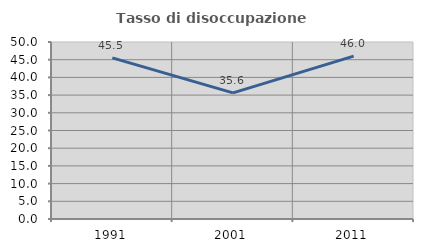
| Category | Tasso di disoccupazione giovanile  |
|---|---|
| 1991.0 | 45.522 |
| 2001.0 | 35.632 |
| 2011.0 | 46 |